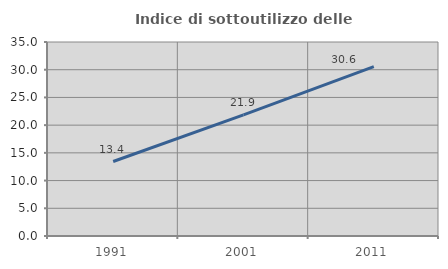
| Category | Indice di sottoutilizzo delle abitazioni  |
|---|---|
| 1991.0 | 13.44 |
| 2001.0 | 21.853 |
| 2011.0 | 30.572 |